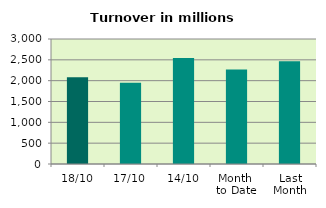
| Category | Series 0 |
|---|---|
| 18/10 | 2081.949 |
| 17/10 | 1952.926 |
| 14/10 | 2541.538 |
| Month 
to Date | 2266.403 |
| Last
Month | 2468.023 |